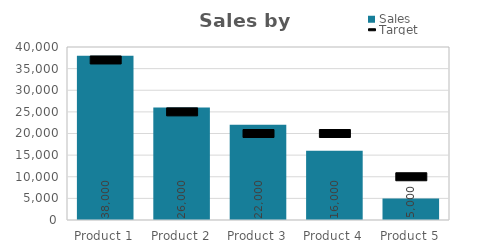
| Category | Sales |
|---|---|
| Product 1 | 38000 |
| Product 2 | 26000 |
| Product 3 | 22000 |
| Product 4 | 16000 |
| Product 5 | 5000 |